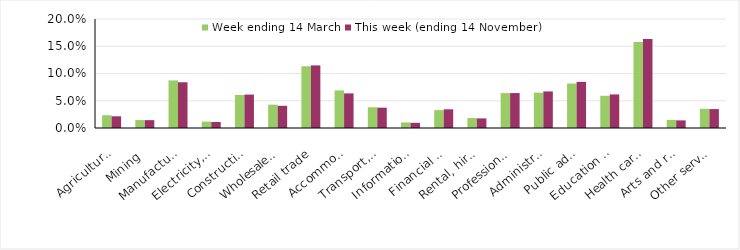
| Category | Week ending 14 March | This week (ending 14 November) |
|---|---|---|
| Agriculture, forestry and fishing | 0.023 | 0.022 |
| Mining | 0.015 | 0.014 |
| Manufacturing | 0.087 | 0.084 |
| Electricity, gas, water and waste services | 0.012 | 0.011 |
| Construction | 0.061 | 0.061 |
| Wholesale trade | 0.043 | 0.041 |
| Retail trade | 0.113 | 0.115 |
| Accommodation and food services | 0.069 | 0.064 |
| Transport, postal and warehousing | 0.038 | 0.037 |
| Information media and telecommunications | 0.01 | 0.01 |
| Financial and insurance services | 0.033 | 0.034 |
| Rental, hiring and real estate services | 0.018 | 0.018 |
| Professional, scientific and technical services | 0.064 | 0.064 |
| Administrative and support services | 0.065 | 0.067 |
| Public administration and safety | 0.082 | 0.085 |
| Education and training | 0.059 | 0.062 |
| Health care and social assistance | 0.158 | 0.163 |
| Arts and recreation services | 0.015 | 0.014 |
| Other services | 0.035 | 0.035 |